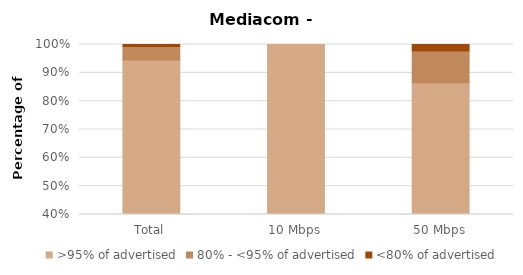
| Category | >95% of advertised | 80% - <95% of advertised | <80% of advertised |
|---|---|---|---|
| Total | 0.946 | 0.043 | 0.011 |
| 10 Mbps | 1 | 0 | 0 |
| 50 Mbps | 0.865 | 0.108 | 0.027 |